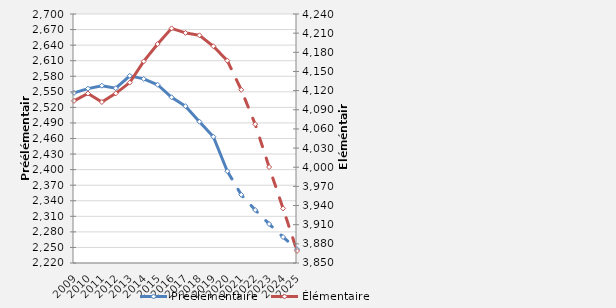
| Category | Préélémentaire |
|---|---|
| 2009.0 | 2547.9 |
| 2010.0 | 2556.1 |
| 2011.0 | 2561.8 |
| 2012.0 | 2557 |
| 2013.0 | 2580.9 |
| 2014.0 | 2574.9 |
| 2015.0 | 2563.6 |
| 2016.0 | 2539.5 |
| 2017.0 | 2522.3 |
| 2018.0 | 2492.5 |
| 2019.0 | 2463.4 |
| 2020.0 | 2396.906 |
| 2021.0 | 2351.54 |
| 2022.0 | 2322.191 |
| 2023.0 | 2295.192 |
| 2024.0 | 2270.073 |
| 2025.0 | 2246.549 |